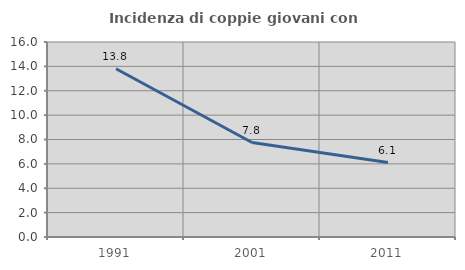
| Category | Incidenza di coppie giovani con figli |
|---|---|
| 1991.0 | 13.805 |
| 2001.0 | 7.752 |
| 2011.0 | 6.108 |